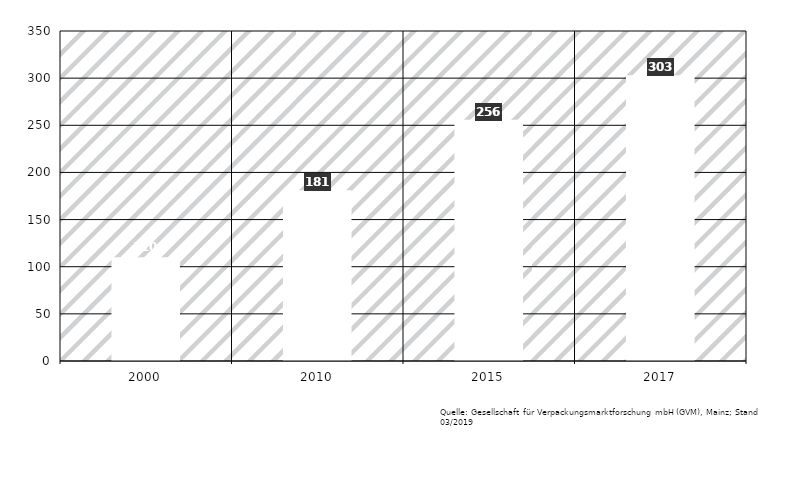
| Category | Verpackungen gesamt |
|---|---|
| 2000.0 | 110 |
| 2010.0 | 181 |
| 2015.0 | 256 |
| 2017.0 | 303 |